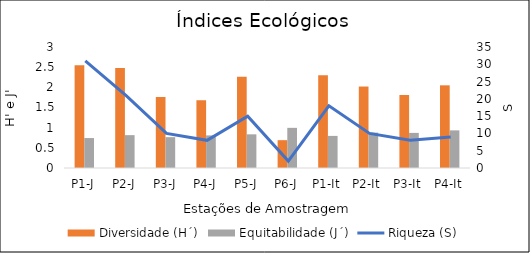
| Category | Diversidade (H´) | Equitabilidade (J´) |
|---|---|---|
| P1-J | 2.55 | 0.743 |
| P2-J | 2.48 | 0.815 |
| P3-J | 1.76 | 0.764 |
| P4-J | 1.68 | 0.808 |
| P5-J | 2.26 | 0.835 |
| P6-J | 0.69 | 0.995 |
| P1-It | 2.3 | 0.796 |
| P2-It | 2.02 | 0.877 |
| P3-It | 1.81 | 0.87 |
| P4-It | 2.05 | 0.933 |